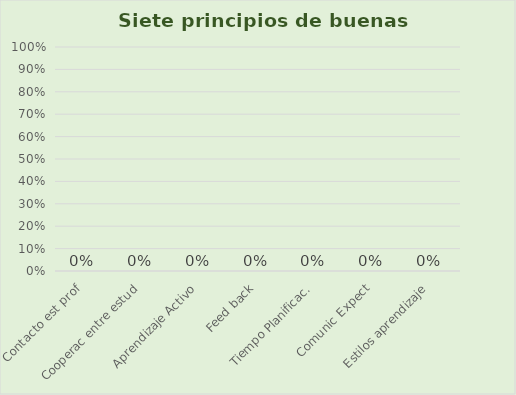
| Category | Series 0 |
|---|---|
| Contacto est prof | 0 |
| Cooperac entre estud | 0 |
| Aprendizaje Activo | 0 |
| Feed back | 0 |
| Tiempo Planificac. | 0 |
| Comunic Expect | 0 |
| Estilos aprendizaje | 0 |